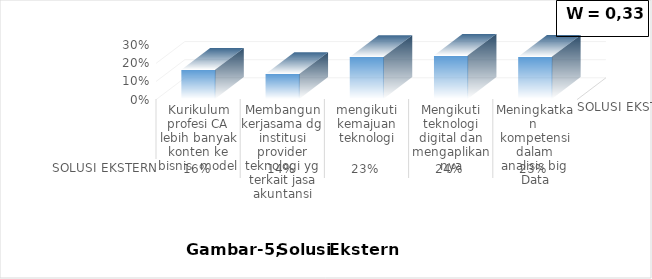
| Category | SOLUSI EKSTERN |
|---|---|
| Kurikulum profesi CA lebih banyak konten ke bisnis  model | 0.161 |
| Membangun kerjasama dg institusi provider teknologi yg terkait jasa akuntansi | 0.137 |
| mengikuti kemajuan teknologi | 0.23 |
| Mengikuti teknologi digital dan mengaplikannya | 0.239 |
| Meningkatkan  kompetensi dalam analisis big Data | 0.232 |